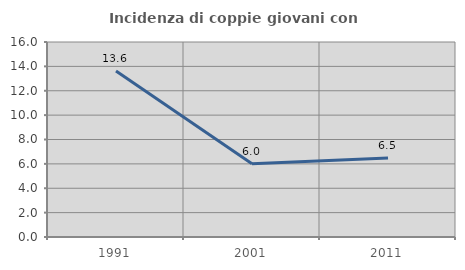
| Category | Incidenza di coppie giovani con figli |
|---|---|
| 1991.0 | 13.625 |
| 2001.0 | 6.009 |
| 2011.0 | 6.491 |